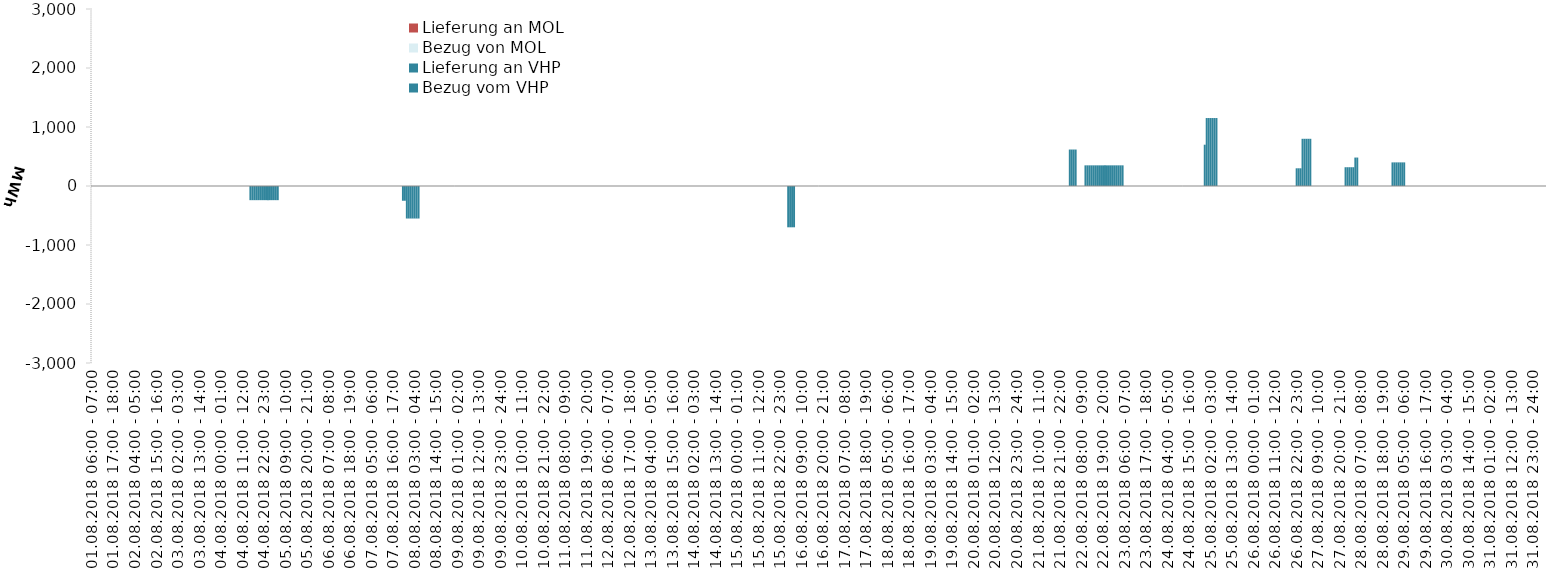
| Category | Bezug vom VHP | Lieferung an VHP | Bezug von MOL | Lieferung an MOL |
|---|---|---|---|---|
| 01.08.2018 06:00 - 07:00 | 0 | 0 | 0 | 0 |
| 01.08.2018 07:00 - 08:00 | 0 | 0 | 0 | 0 |
| 01.08.2018 08:00 - 09:00 | 0 | 0 | 0 | 0 |
| 01.08.2018 09:00 - 10:00 | 0 | 0 | 0 | 0 |
| 01.08.2018 10:00 - 11:00 | 0 | 0 | 0 | 0 |
| 01.08.2018 11:00 - 12:00 | 0 | 0 | 0 | 0 |
| 01.08.2018 12:00 - 13:00 | 0 | 0 | 0 | 0 |
| 01.08.2018 13:00 - 14:00 | 0 | 0 | 0 | 0 |
| 01.08.2018 14:00 - 15:00 | 0 | 0 | 0 | 0 |
| 01.08.2018 15:00 - 16:00 | 0 | 0 | 0 | 0 |
| 01.08.2018 16:00 - 17:00 | 0 | 0 | 0 | 0 |
| 01.08.2018 17:00 - 18:00 | 0 | 0 | 0 | 0 |
| 01.08.2018 18:00 - 19:00 | 0 | 0 | 0 | 0 |
| 01.08.2018 19:00 - 20:00 | 0 | 0 | 0 | 0 |
| 01.08.2018 20:00 - 21:00 | 0 | 0 | 0 | 0 |
| 01.08.2018 21:00 - 22:00 | 0 | 0 | 0 | 0 |
| 01.08.2018 22:00 - 23:00 | 0 | 0 | 0 | 0 |
| 01.08.2018 23:00 - 24:00 | 0 | 0 | 0 | 0 |
| 02.08.2018 00:00 - 01:00 | 0 | 0 | 0 | 0 |
| 02.08.2018 01:00 - 02:00 | 0 | 0 | 0 | 0 |
| 02.08.2018 02:00 - 03:00 | 0 | 0 | 0 | 0 |
| 02.08.2018 03:00 - 04:00 | 0 | 0 | 0 | 0 |
| 02.08.2018 04:00 - 05:00 | 0 | 0 | 0 | 0 |
| 02.08.2018 05:00 - 06:00 | 0 | 0 | 0 | 0 |
| 02.08.2018 06:00 - 07:00 | 0 | 0 | 0 | 0 |
| 02.08.2018 07:00 - 08:00 | 0 | 0 | 0 | 0 |
| 02.08.2018 08:00 - 09:00 | 0 | 0 | 0 | 0 |
| 02.08.2018 09:00 - 10:00 | 0 | 0 | 0 | 0 |
| 02.08.2018 10:00 - 11:00 | 0 | 0 | 0 | 0 |
| 02.08.2018 11:00 - 12:00 | 0 | 0 | 0 | 0 |
| 02.08.2018 12:00 - 13:00 | 0 | 0 | 0 | 0 |
| 02.08.2018 13:00 - 14:00 | 0 | 0 | 0 | 0 |
| 02.08.2018 14:00 - 15:00 | 0 | 0 | 0 | 0 |
| 02.08.2018 15:00 - 16:00 | 0 | 0 | 0 | 0 |
| 02.08.2018 16:00 - 17:00 | 0 | 0 | 0 | 0 |
| 02.08.2018 17:00 - 18:00 | 0 | 0 | 0 | 0 |
| 02.08.2018 18:00 - 19:00 | 0 | 0 | 0 | 0 |
| 02.08.2018 19:00 - 20:00 | 0 | 0 | 0 | 0 |
| 02.08.2018 20:00 - 21:00 | 0 | 0 | 0 | 0 |
| 02.08.2018 21:00 - 22:00 | 0 | 0 | 0 | 0 |
| 02.08.2018 22:00 - 23:00 | 0 | 0 | 0 | 0 |
| 02.08.2018 23:00 - 24:00 | 0 | 0 | 0 | 0 |
| 03.08.2018 00:00 - 01:00 | 0 | 0 | 0 | 0 |
| 03.08.2018 01:00 - 02:00 | 0 | 0 | 0 | 0 |
| 03.08.2018 02:00 - 03:00 | 0 | 0 | 0 | 0 |
| 03.08.2018 03:00 - 04:00 | 0 | 0 | 0 | 0 |
| 03.08.2018 04:00 - 05:00 | 0 | 0 | 0 | 0 |
| 03.08.2018 05:00 - 06:00 | 0 | 0 | 0 | 0 |
| 03.08.2018 06:00 - 07:00 | 0 | 0 | 0 | 0 |
| 03.08.2018 07:00 - 08:00 | 0 | 0 | 0 | 0 |
| 03.08.2018 08:00 - 09:00 | 0 | 0 | 0 | 0 |
| 03.08.2018 09:00 - 10:00 | 0 | 0 | 0 | 0 |
| 03.08.2018 10:00 - 11:00 | 0 | 0 | 0 | 0 |
| 03.08.2018 11:00 - 12:00 | 0 | 0 | 0 | 0 |
| 03.08.2018 12:00 - 13:00 | 0 | 0 | 0 | 0 |
| 03.08.2018 13:00 - 14:00 | 0 | 0 | 0 | 0 |
| 03.08.2018 14:00 - 15:00 | 0 | 0 | 0 | 0 |
| 03.08.2018 15:00 - 16:00 | 0 | 0 | 0 | 0 |
| 03.08.2018 16:00 - 17:00 | 0 | 0 | 0 | 0 |
| 03.08.2018 17:00 - 18:00 | 0 | 0 | 0 | 0 |
| 03.08.2018 18:00 - 19:00 | 0 | 0 | 0 | 0 |
| 03.08.2018 19:00 - 20:00 | 0 | 0 | 0 | 0 |
| 03.08.2018 20:00 - 21:00 | 0 | 0 | 0 | 0 |
| 03.08.2018 21:00 - 22:00 | 0 | 0 | 0 | 0 |
| 03.08.2018 22:00 - 23:00 | 0 | 0 | 0 | 0 |
| 03.08.2018 23:00 - 24:00 | 0 | 0 | 0 | 0 |
| 04.08.2018 00:00 - 01:00 | 0 | 0 | 0 | 0 |
| 04.08.2018 01:00 - 02:00 | 0 | 0 | 0 | 0 |
| 04.08.2018 02:00 - 03:00 | 0 | 0 | 0 | 0 |
| 04.08.2018 03:00 - 04:00 | 0 | 0 | 0 | 0 |
| 04.08.2018 04:00 - 05:00 | 0 | 0 | 0 | 0 |
| 04.08.2018 05:00 - 06:00 | 0 | 0 | 0 | 0 |
| 04.08.2018 06:00 - 07:00 | 0 | 0 | 0 | 0 |
| 04.08.2018 07:00 - 08:00 | 0 | 0 | 0 | 0 |
| 04.08.2018 08:00 - 09:00 | 0 | 0 | 0 | 0 |
| 04.08.2018 09:00 - 10:00 | 0 | 0 | 0 | 0 |
| 04.08.2018 10:00 - 11:00 | 0 | 0 | 0 | 0 |
| 04.08.2018 11:00 - 12:00 | 0 | 0 | 0 | 0 |
| 04.08.2018 12:00 - 13:00 | 0 | 0 | 0 | 0 |
| 04.08.2018 13:00 - 14:00 | 0 | 0 | 0 | 0 |
| 04.08.2018 14:00 - 15:00 | 0 | 0 | 0 | 0 |
| 04.08.2018 15:00 - 16:00 | 0 | -240 | 0 | 0 |
| 04.08.2018 16:00 - 17:00 | 0 | -240 | 0 | 0 |
| 04.08.2018 17:00 - 18:00 | 0 | -240 | 0 | 0 |
| 04.08.2018 18:00 - 19:00 | 0 | -240 | 0 | 0 |
| 04.08.2018 19:00 - 20:00 | 0 | -240 | 0 | 0 |
| 04.08.2018 20:00 - 21:00 | 0 | -240 | 0 | 0 |
| 04.08.2018 21:00 - 22:00 | 0 | -240 | 0 | 0 |
| 04.08.2018 22:00 - 23:00 | 0 | -240 | 0 | 0 |
| 04.08.2018 23:00 - 24:00 | 0 | -240 | 0 | 0 |
| 05.08.2018 00:00 - 01:00 | 0 | -240 | 0 | 0 |
| 05.08.2018 01:00 - 02:00 | 0 | -240 | 0 | 0 |
| 05.08.2018 02:00 - 03:00 | 0 | -240 | 0 | 0 |
| 05.08.2018 03:00 - 04:00 | 0 | -240 | 0 | 0 |
| 05.08.2018 04:00 - 05:00 | 0 | -240 | 0 | 0 |
| 05.08.2018 05:00 - 06:00 | 0 | -240 | 0 | 0 |
| 05.08.2018 06:00 - 07:00 | 0 | 0 | 0 | 0 |
| 05.08.2018 07:00 - 08:00 | 0 | 0 | 0 | 0 |
| 05.08.2018 08:00 - 09:00 | 0 | 0 | 0 | 0 |
| 05.08.2018 09:00 - 10:00 | 0 | 0 | 0 | 0 |
| 05.08.2018 10:00 - 11:00 | 0 | 0 | 0 | 0 |
| 05.08.2018 11:00 - 12:00 | 0 | 0 | 0 | 0 |
| 05.08.2018 12:00 - 13:00 | 0 | 0 | 0 | 0 |
| 05.08.2018 13:00 - 14:00 | 0 | 0 | 0 | 0 |
| 05.08.2018 14:00 - 15:00 | 0 | 0 | 0 | 0 |
| 05.08.2018 15:00 - 16:00 | 0 | 0 | 0 | 0 |
| 05.08.2018 16:00 - 17:00 | 0 | 0 | 0 | 0 |
| 05.08.2018 17:00 - 18:00 | 0 | 0 | 0 | 0 |
| 05.08.2018 18:00 - 19:00 | 0 | 0 | 0 | 0 |
| 05.08.2018 19:00 - 20:00 | 0 | 0 | 0 | 0 |
| 05.08.2018 20:00 - 21:00 | 0 | 0 | 0 | 0 |
| 05.08.2018 21:00 - 22:00 | 0 | 0 | 0 | 0 |
| 05.08.2018 22:00 - 23:00 | 0 | 0 | 0 | 0 |
| 05.08.2018 23:00 - 24:00 | 0 | 0 | 0 | 0 |
| 06.08.2018 00:00 - 01:00 | 0 | 0 | 0 | 0 |
| 06.08.2018 01:00 - 02:00 | 0 | 0 | 0 | 0 |
| 06.08.2018 02:00 - 03:00 | 0 | 0 | 0 | 0 |
| 06.08.2018 03:00 - 04:00 | 0 | 0 | 0 | 0 |
| 06.08.2018 04:00 - 05:00 | 0 | 0 | 0 | 0 |
| 06.08.2018 05:00 - 06:00 | 0 | 0 | 0 | 0 |
| 06.08.2018 06:00 - 07:00 | 0 | 0 | 0 | 0 |
| 06.08.2018 07:00 - 08:00 | 0 | 0 | 0 | 0 |
| 06.08.2018 08:00 - 09:00 | 0 | 0 | 0 | 0 |
| 06.08.2018 09:00 - 10:00 | 0 | 0 | 0 | 0 |
| 06.08.2018 10:00 - 11:00 | 0 | 0 | 0 | 0 |
| 06.08.2018 11:00 - 12:00 | 0 | 0 | 0 | 0 |
| 06.08.2018 12:00 - 13:00 | 0 | 0 | 0 | 0 |
| 06.08.2018 13:00 - 14:00 | 0 | 0 | 0 | 0 |
| 06.08.2018 14:00 - 15:00 | 0 | 0 | 0 | 0 |
| 06.08.2018 15:00 - 16:00 | 0 | 0 | 0 | 0 |
| 06.08.2018 16:00 - 17:00 | 0 | 0 | 0 | 0 |
| 06.08.2018 17:00 - 18:00 | 0 | 0 | 0 | 0 |
| 06.08.2018 18:00 - 19:00 | 0 | 0 | 0 | 0 |
| 06.08.2018 19:00 - 20:00 | 0 | 0 | 0 | 0 |
| 06.08.2018 20:00 - 21:00 | 0 | 0 | 0 | 0 |
| 06.08.2018 21:00 - 22:00 | 0 | 0 | 0 | 0 |
| 06.08.2018 22:00 - 23:00 | 0 | 0 | 0 | 0 |
| 06.08.2018 23:00 - 24:00 | 0 | 0 | 0 | 0 |
| 07.08.2018 00:00 - 01:00 | 0 | 0 | 0 | 0 |
| 07.08.2018 01:00 - 02:00 | 0 | 0 | 0 | 0 |
| 07.08.2018 02:00 - 03:00 | 0 | 0 | 0 | 0 |
| 07.08.2018 03:00 - 04:00 | 0 | 0 | 0 | 0 |
| 07.08.2018 04:00 - 05:00 | 0 | 0 | 0 | 0 |
| 07.08.2018 05:00 - 06:00 | 0 | 0 | 0 | 0 |
| 07.08.2018 06:00 - 07:00 | 0 | 0 | 0 | 0 |
| 07.08.2018 07:00 - 08:00 | 0 | 0 | 0 | 0 |
| 07.08.2018 08:00 - 09:00 | 0 | 0 | 0 | 0 |
| 07.08.2018 09:00 - 10:00 | 0 | 0 | 0 | 0 |
| 07.08.2018 10:00 - 11:00 | 0 | 0 | 0 | 0 |
| 07.08.2018 11:00 - 12:00 | 0 | 0 | 0 | 0 |
| 07.08.2018 12:00 - 13:00 | 0 | 0 | 0 | 0 |
| 07.08.2018 13:00 - 14:00 | 0 | 0 | 0 | 0 |
| 07.08.2018 14:00 - 15:00 | 0 | 0 | 0 | 0 |
| 07.08.2018 15:00 - 16:00 | 0 | 0 | 0 | 0 |
| 07.08.2018 16:00 - 17:00 | 0 | 0 | 0 | 0 |
| 07.08.2018 17:00 - 18:00 | 0 | 0 | 0 | 0 |
| 07.08.2018 18:00 - 19:00 | 0 | 0 | 0 | 0 |
| 07.08.2018 19:00 - 20:00 | 0 | 0 | 0 | 0 |
| 07.08.2018 20:00 - 21:00 | 0 | 0 | 0 | 0 |
| 07.08.2018 21:00 - 22:00 | 0 | -250 | 0 | 0 |
| 07.08.2018 22:00 - 23:00 | 0 | -250 | 0 | 0 |
| 07.08.2018 23:00 - 24:00 | 0 | -551 | 0 | 0 |
| 08.08.2018 00:00 - 01:00 | 0 | -551 | 0 | 0 |
| 08.08.2018 01:00 - 02:00 | 0 | -551 | 0 | 0 |
| 08.08.2018 02:00 - 03:00 | 0 | -551 | 0 | 0 |
| 08.08.2018 03:00 - 04:00 | 0 | -551 | 0 | 0 |
| 08.08.2018 04:00 - 05:00 | 0 | -551 | 0 | 0 |
| 08.08.2018 05:00 - 06:00 | 0 | -551 | 0 | 0 |
| 08.08.2018 06:00 - 07:00 | 0 | 0 | 0 | 0 |
| 08.08.2018 07:00 - 08:00 | 0 | 0 | 0 | 0 |
| 08.08.2018 08:00 - 09:00 | 0 | 0 | 0 | 0 |
| 08.08.2018 09:00 - 10:00 | 0 | 0 | 0 | 0 |
| 08.08.2018 10:00 - 11:00 | 0 | 0 | 0 | 0 |
| 08.08.2018 11:00 - 12:00 | 0 | 0 | 0 | 0 |
| 08.08.2018 12:00 - 13:00 | 0 | 0 | 0 | 0 |
| 08.08.2018 13:00 - 14:00 | 0 | 0 | 0 | 0 |
| 08.08.2018 14:00 - 15:00 | 0 | 0 | 0 | 0 |
| 08.08.2018 15:00 - 16:00 | 0 | 0 | 0 | 0 |
| 08.08.2018 16:00 - 17:00 | 0 | 0 | 0 | 0 |
| 08.08.2018 17:00 - 18:00 | 0 | 0 | 0 | 0 |
| 08.08.2018 18:00 - 19:00 | 0 | 0 | 0 | 0 |
| 08.08.2018 19:00 - 20:00 | 0 | 0 | 0 | 0 |
| 08.08.2018 20:00 - 21:00 | 0 | 0 | 0 | 0 |
| 08.08.2018 21:00 - 22:00 | 0 | 0 | 0 | 0 |
| 08.08.2018 22:00 - 23:00 | 0 | 0 | 0 | 0 |
| 08.08.2018 23:00 - 24:00 | 0 | 0 | 0 | 0 |
| 09.08.2018 00:00 - 01:00 | 0 | 0 | 0 | 0 |
| 09.08.2018 01:00 - 02:00 | 0 | 0 | 0 | 0 |
| 09.08.2018 02:00 - 03:00 | 0 | 0 | 0 | 0 |
| 09.08.2018 03:00 - 04:00 | 0 | 0 | 0 | 0 |
| 09.08.2018 04:00 - 05:00 | 0 | 0 | 0 | 0 |
| 09.08.2018 05:00 - 06:00 | 0 | 0 | 0 | 0 |
| 09.08.2018 06:00 - 07:00 | 0 | 0 | 0 | 0 |
| 09.08.2018 07:00 - 08:00 | 0 | 0 | 0 | 0 |
| 09.08.2018 08:00 - 09:00 | 0 | 0 | 0 | 0 |
| 09.08.2018 09:00 - 10:00 | 0 | 0 | 0 | 0 |
| 09.08.2018 10:00 - 11:00 | 0 | 0 | 0 | 0 |
| 09.08.2018 11:00 - 12:00 | 0 | 0 | 0 | 0 |
| 09.08.2018 12:00 - 13:00 | 0 | 0 | 0 | 0 |
| 09.08.2018 13:00 - 14:00 | 0 | 0 | 0 | 0 |
| 09.08.2018 14:00 - 15:00 | 0 | 0 | 0 | 0 |
| 09.08.2018 15:00 - 16:00 | 0 | 0 | 0 | 0 |
| 09.08.2018 16:00 - 17:00 | 0 | 0 | 0 | 0 |
| 09.08.2018 17:00 - 18:00 | 0 | 0 | 0 | 0 |
| 09.08.2018 18:00 - 19:00 | 0 | 0 | 0 | 0 |
| 09.08.2018 19:00 - 20:00 | 0 | 0 | 0 | 0 |
| 09.08.2018 20:00 - 21:00 | 0 | 0 | 0 | 0 |
| 09.08.2018 21:00 - 22:00 | 0 | 0 | 0 | 0 |
| 09.08.2018 22:00 - 23:00 | 0 | 0 | 0 | 0 |
| 09.08.2018 23:00 - 24:00 | 0 | 0 | 0 | 0 |
| 10.08.2018 00:00 - 01:00 | 0 | 0 | 0 | 0 |
| 10.08.2018 01:00 - 02:00 | 0 | 0 | 0 | 0 |
| 10.08.2018 02:00 - 03:00 | 0 | 0 | 0 | 0 |
| 10.08.2018 03:00 - 04:00 | 0 | 0 | 0 | 0 |
| 10.08.2018 04:00 - 05:00 | 0 | 0 | 0 | 0 |
| 10.08.2018 05:00 - 06:00 | 0 | 0 | 0 | 0 |
| 10.08.2018 06:00 - 07:00 | 0 | 0 | 0 | 0 |
| 10.08.2018 07:00 - 08:00 | 0 | 0 | 0 | 0 |
| 10.08.2018 08:00 - 09:00 | 0 | 0 | 0 | 0 |
| 10.08.2018 09:00 - 10:00 | 0 | 0 | 0 | 0 |
| 10.08.2018 10:00 - 11:00 | 0 | 0 | 0 | 0 |
| 10.08.2018 11:00 - 12:00 | 0 | 0 | 0 | 0 |
| 10.08.2018 12:00 - 13:00 | 0 | 0 | 0 | 0 |
| 10.08.2018 13:00 - 14:00 | 0 | 0 | 0 | 0 |
| 10.08.2018 14:00 - 15:00 | 0 | 0 | 0 | 0 |
| 10.08.2018 15:00 - 16:00 | 0 | 0 | 0 | 0 |
| 10.08.2018 16:00 - 17:00 | 0 | 0 | 0 | 0 |
| 10.08.2018 17:00 - 18:00 | 0 | 0 | 0 | 0 |
| 10.08.2018 18:00 - 19:00 | 0 | 0 | 0 | 0 |
| 10.08.2018 19:00 - 20:00 | 0 | 0 | 0 | 0 |
| 10.08.2018 20:00 - 21:00 | 0 | 0 | 0 | 0 |
| 10.08.2018 21:00 - 22:00 | 0 | 0 | 0 | 0 |
| 10.08.2018 22:00 - 23:00 | 0 | 0 | 0 | 0 |
| 10.08.2018 23:00 - 24:00 | 0 | 0 | 0 | 0 |
| 11.08.2018 00:00 - 01:00 | 0 | 0 | 0 | 0 |
| 11.08.2018 01:00 - 02:00 | 0 | 0 | 0 | 0 |
| 11.08.2018 02:00 - 03:00 | 0 | 0 | 0 | 0 |
| 11.08.2018 03:00 - 04:00 | 0 | 0 | 0 | 0 |
| 11.08.2018 04:00 - 05:00 | 0 | 0 | 0 | 0 |
| 11.08.2018 05:00 - 06:00 | 0 | 0 | 0 | 0 |
| 11.08.2018 06:00 - 07:00 | 0 | 0 | 0 | 0 |
| 11.08.2018 07:00 - 08:00 | 0 | 0 | 0 | 0 |
| 11.08.2018 08:00 - 09:00 | 0 | 0 | 0 | 0 |
| 11.08.2018 09:00 - 10:00 | 0 | 0 | 0 | 0 |
| 11.08.2018 10:00 - 11:00 | 0 | 0 | 0 | 0 |
| 11.08.2018 11:00 - 12:00 | 0 | 0 | 0 | 0 |
| 11.08.2018 12:00 - 13:00 | 0 | 0 | 0 | 0 |
| 11.08.2018 13:00 - 14:00 | 0 | 0 | 0 | 0 |
| 11.08.2018 14:00 - 15:00 | 0 | 0 | 0 | 0 |
| 11.08.2018 15:00 - 16:00 | 0 | 0 | 0 | 0 |
| 11.08.2018 16:00 - 17:00 | 0 | 0 | 0 | 0 |
| 11.08.2018 17:00 - 18:00 | 0 | 0 | 0 | 0 |
| 11.08.2018 18:00 - 19:00 | 0 | 0 | 0 | 0 |
| 11.08.2018 19:00 - 20:00 | 0 | 0 | 0 | 0 |
| 11.08.2018 20:00 - 21:00 | 0 | 0 | 0 | 0 |
| 11.08.2018 21:00 - 22:00 | 0 | 0 | 0 | 0 |
| 11.08.2018 22:00 - 23:00 | 0 | 0 | 0 | 0 |
| 11.08.2018 23:00 - 24:00 | 0 | 0 | 0 | 0 |
| 12.08.2018 00:00 - 01:00 | 0 | 0 | 0 | 0 |
| 12.08.2018 01:00 - 02:00 | 0 | 0 | 0 | 0 |
| 12.08.2018 02:00 - 03:00 | 0 | 0 | 0 | 0 |
| 12.08.2018 03:00 - 04:00 | 0 | 0 | 0 | 0 |
| 12.08.2018 04:00 - 05:00 | 0 | 0 | 0 | 0 |
| 12.08.2018 05:00 - 06:00 | 0 | 0 | 0 | 0 |
| 12.08.2018 06:00 - 07:00 | 0 | 0 | 0 | 0 |
| 12.08.2018 07:00 - 08:00 | 0 | 0 | 0 | 0 |
| 12.08.2018 08:00 - 09:00 | 0 | 0 | 0 | 0 |
| 12.08.2018 09:00 - 10:00 | 0 | 0 | 0 | 0 |
| 12.08.2018 10:00 - 11:00 | 0 | 0 | 0 | 0 |
| 12.08.2018 11:00 - 12:00 | 0 | 0 | 0 | 0 |
| 12.08.2018 12:00 - 13:00 | 0 | 0 | 0 | 0 |
| 12.08.2018 13:00 - 14:00 | 0 | 0 | 0 | 0 |
| 12.08.2018 14:00 - 15:00 | 0 | 0 | 0 | 0 |
| 12.08.2018 15:00 - 16:00 | 0 | 0 | 0 | 0 |
| 12.08.2018 16:00 - 17:00 | 0 | 0 | 0 | 0 |
| 12.08.2018 17:00 - 18:00 | 0 | 0 | 0 | 0 |
| 12.08.2018 18:00 - 19:00 | 0 | 0 | 0 | 0 |
| 12.08.2018 19:00 - 20:00 | 0 | 0 | 0 | 0 |
| 12.08.2018 20:00 - 21:00 | 0 | 0 | 0 | 0 |
| 12.08.2018 21:00 - 22:00 | 0 | 0 | 0 | 0 |
| 12.08.2018 22:00 - 23:00 | 0 | 0 | 0 | 0 |
| 12.08.2018 23:00 - 24:00 | 0 | 0 | 0 | 0 |
| 13.08.2018 00:00 - 01:00 | 0 | 0 | 0 | 0 |
| 13.08.2018 01:00 - 02:00 | 0 | 0 | 0 | 0 |
| 13.08.2018 02:00 - 03:00 | 0 | 0 | 0 | 0 |
| 13.08.2018 03:00 - 04:00 | 0 | 0 | 0 | 0 |
| 13.08.2018 04:00 - 05:00 | 0 | 0 | 0 | 0 |
| 13.08.2018 05:00 - 06:00 | 0 | 0 | 0 | 0 |
| 13.08.2018 06:00 - 07:00 | 0 | 0 | 0 | 0 |
| 13.08.2018 07:00 - 08:00 | 0 | 0 | 0 | 0 |
| 13.08.2018 08:00 - 09:00 | 0 | 0 | 0 | 0 |
| 13.08.2018 09:00 - 10:00 | 0 | 0 | 0 | 0 |
| 13.08.2018 10:00 - 11:00 | 0 | 0 | 0 | 0 |
| 13.08.2018 11:00 - 12:00 | 0 | 0 | 0 | 0 |
| 13.08.2018 12:00 - 13:00 | 0 | 0 | 0 | 0 |
| 13.08.2018 13:00 - 14:00 | 0 | 0 | 0 | 0 |
| 13.08.2018 14:00 - 15:00 | 0 | 0 | 0 | 0 |
| 13.08.2018 15:00 - 16:00 | 0 | 0 | 0 | 0 |
| 13.08.2018 16:00 - 17:00 | 0 | 0 | 0 | 0 |
| 13.08.2018 17:00 - 18:00 | 0 | 0 | 0 | 0 |
| 13.08.2018 18:00 - 19:00 | 0 | 0 | 0 | 0 |
| 13.08.2018 19:00 - 20:00 | 0 | 0 | 0 | 0 |
| 13.08.2018 20:00 - 21:00 | 0 | 0 | 0 | 0 |
| 13.08.2018 21:00 - 22:00 | 0 | 0 | 0 | 0 |
| 13.08.2018 22:00 - 23:00 | 0 | 0 | 0 | 0 |
| 13.08.2018 23:00 - 24:00 | 0 | 0 | 0 | 0 |
| 14.08.2018 00:00 - 01:00 | 0 | 0 | 0 | 0 |
| 14.08.2018 01:00 - 02:00 | 0 | 0 | 0 | 0 |
| 14.08.2018 02:00 - 03:00 | 0 | 0 | 0 | 0 |
| 14.08.2018 03:00 - 04:00 | 0 | 0 | 0 | 0 |
| 14.08.2018 04:00 - 05:00 | 0 | 0 | 0 | 0 |
| 14.08.2018 05:00 - 06:00 | 0 | 0 | 0 | 0 |
| 14.08.2018 06:00 - 07:00 | 0 | 0 | 0 | 0 |
| 14.08.2018 07:00 - 08:00 | 0 | 0 | 0 | 0 |
| 14.08.2018 08:00 - 09:00 | 0 | 0 | 0 | 0 |
| 14.08.2018 09:00 - 10:00 | 0 | 0 | 0 | 0 |
| 14.08.2018 10:00 - 11:00 | 0 | 0 | 0 | 0 |
| 14.08.2018 11:00 - 12:00 | 0 | 0 | 0 | 0 |
| 14.08.2018 12:00 - 13:00 | 0 | 0 | 0 | 0 |
| 14.08.2018 13:00 - 14:00 | 0 | 0 | 0 | 0 |
| 14.08.2018 14:00 - 15:00 | 0 | 0 | 0 | 0 |
| 14.08.2018 15:00 - 16:00 | 0 | 0 | 0 | 0 |
| 14.08.2018 16:00 - 17:00 | 0 | 0 | 0 | 0 |
| 14.08.2018 17:00 - 18:00 | 0 | 0 | 0 | 0 |
| 14.08.2018 18:00 - 19:00 | 0 | 0 | 0 | 0 |
| 14.08.2018 19:00 - 20:00 | 0 | 0 | 0 | 0 |
| 14.08.2018 20:00 - 21:00 | 0 | 0 | 0 | 0 |
| 14.08.2018 21:00 - 22:00 | 0 | 0 | 0 | 0 |
| 14.08.2018 22:00 - 23:00 | 0 | 0 | 0 | 0 |
| 14.08.2018 23:00 - 24:00 | 0 | 0 | 0 | 0 |
| 15.08.2018 00:00 - 01:00 | 0 | 0 | 0 | 0 |
| 15.08.2018 01:00 - 02:00 | 0 | 0 | 0 | 0 |
| 15.08.2018 02:00 - 03:00 | 0 | 0 | 0 | 0 |
| 15.08.2018 03:00 - 04:00 | 0 | 0 | 0 | 0 |
| 15.08.2018 04:00 - 05:00 | 0 | 0 | 0 | 0 |
| 15.08.2018 05:00 - 06:00 | 0 | 0 | 0 | 0 |
| 15.08.2018 06:00 - 07:00 | 0 | 0 | 0 | 0 |
| 15.08.2018 07:00 - 08:00 | 0 | 0 | 0 | 0 |
| 15.08.2018 08:00 - 09:00 | 0 | 0 | 0 | 0 |
| 15.08.2018 09:00 - 10:00 | 0 | 0 | 0 | 0 |
| 15.08.2018 10:00 - 11:00 | 0 | 0 | 0 | 0 |
| 15.08.2018 11:00 - 12:00 | 0 | 0 | 0 | 0 |
| 15.08.2018 12:00 - 13:00 | 0 | 0 | 0 | 0 |
| 15.08.2018 13:00 - 14:00 | 0 | 0 | 0 | 0 |
| 15.08.2018 14:00 - 15:00 | 0 | 0 | 0 | 0 |
| 15.08.2018 15:00 - 16:00 | 0 | 0 | 0 | 0 |
| 15.08.2018 16:00 - 17:00 | 0 | 0 | 0 | 0 |
| 15.08.2018 17:00 - 18:00 | 0 | 0 | 0 | 0 |
| 15.08.2018 18:00 - 19:00 | 0 | 0 | 0 | 0 |
| 15.08.2018 19:00 - 20:00 | 0 | 0 | 0 | 0 |
| 15.08.2018 20:00 - 21:00 | 0 | 0 | 0 | 0 |
| 15.08.2018 21:00 - 22:00 | 0 | 0 | 0 | 0 |
| 15.08.2018 22:00 - 23:00 | 0 | 0 | 0 | 0 |
| 15.08.2018 23:00 - 24:00 | 0 | 0 | 0 | 0 |
| 16.08.2018 00:00 - 01:00 | 0 | 0 | 0 | 0 |
| 16.08.2018 01:00 - 02:00 | 0 | 0 | 0 | 0 |
| 16.08.2018 02:00 - 03:00 | 0 | -700 | 0 | 0 |
| 16.08.2018 03:00 - 04:00 | 0 | -700 | 0 | 0 |
| 16.08.2018 04:00 - 05:00 | 0 | -700 | 0 | 0 |
| 16.08.2018 05:00 - 06:00 | 0 | -700 | 0 | 0 |
| 16.08.2018 06:00 - 07:00 | 0 | 0 | 0 | 0 |
| 16.08.2018 07:00 - 08:00 | 0 | 0 | 0 | 0 |
| 16.08.2018 08:00 - 09:00 | 0 | 0 | 0 | 0 |
| 16.08.2018 09:00 - 10:00 | 0 | 0 | 0 | 0 |
| 16.08.2018 10:00 - 11:00 | 0 | 0 | 0 | 0 |
| 16.08.2018 11:00 - 12:00 | 0 | 0 | 0 | 0 |
| 16.08.2018 12:00 - 13:00 | 0 | 0 | 0 | 0 |
| 16.08.2018 13:00 - 14:00 | 0 | 0 | 0 | 0 |
| 16.08.2018 14:00 - 15:00 | 0 | 0 | 0 | 0 |
| 16.08.2018 15:00 - 16:00 | 0 | 0 | 0 | 0 |
| 16.08.2018 16:00 - 17:00 | 0 | 0 | 0 | 0 |
| 16.08.2018 17:00 - 18:00 | 0 | 0 | 0 | 0 |
| 16.08.2018 18:00 - 19:00 | 0 | 0 | 0 | 0 |
| 16.08.2018 19:00 - 20:00 | 0 | 0 | 0 | 0 |
| 16.08.2018 20:00 - 21:00 | 0 | 0 | 0 | 0 |
| 16.08.2018 21:00 - 22:00 | 0 | 0 | 0 | 0 |
| 16.08.2018 22:00 - 23:00 | 0 | 0 | 0 | 0 |
| 16.08.2018 23:00 - 24:00 | 0 | 0 | 0 | 0 |
| 17.08.2018 00:00 - 01:00 | 0 | 0 | 0 | 0 |
| 17.08.2018 01:00 - 02:00 | 0 | 0 | 0 | 0 |
| 17.08.2018 02:00 - 03:00 | 0 | 0 | 0 | 0 |
| 17.08.2018 03:00 - 04:00 | 0 | 0 | 0 | 0 |
| 17.08.2018 04:00 - 05:00 | 0 | 0 | 0 | 0 |
| 17.08.2018 05:00 - 06:00 | 0 | 0 | 0 | 0 |
| 17.08.2018 06:00 - 07:00 | 0 | 0 | 0 | 0 |
| 17.08.2018 07:00 - 08:00 | 0 | 0 | 0 | 0 |
| 17.08.2018 08:00 - 09:00 | 0 | 0 | 0 | 0 |
| 17.08.2018 09:00 - 10:00 | 0 | 0 | 0 | 0 |
| 17.08.2018 10:00 - 11:00 | 0 | 0 | 0 | 0 |
| 17.08.2018 11:00 - 12:00 | 0 | 0 | 0 | 0 |
| 17.08.2018 12:00 - 13:00 | 0 | 0 | 0 | 0 |
| 17.08.2018 13:00 - 14:00 | 0 | 0 | 0 | 0 |
| 17.08.2018 14:00 - 15:00 | 0 | 0 | 0 | 0 |
| 17.08.2018 15:00 - 16:00 | 0 | 0 | 0 | 0 |
| 17.08.2018 16:00 - 17:00 | 0 | 0 | 0 | 0 |
| 17.08.2018 17:00 - 18:00 | 0 | 0 | 0 | 0 |
| 17.08.2018 18:00 - 19:00 | 0 | 0 | 0 | 0 |
| 17.08.2018 19:00 - 20:00 | 0 | 0 | 0 | 0 |
| 17.08.2018 20:00 - 21:00 | 0 | 0 | 0 | 0 |
| 17.08.2018 21:00 - 22:00 | 0 | 0 | 0 | 0 |
| 17.08.2018 22:00 - 23:00 | 0 | 0 | 0 | 0 |
| 17.08.2018 23:00 - 24:00 | 0 | 0 | 0 | 0 |
| 18.08.2018 00:00 - 01:00 | 0 | 0 | 0 | 0 |
| 18.08.2018 01:00 - 02:00 | 0 | 0 | 0 | 0 |
| 18.08.2018 02:00 - 03:00 | 0 | 0 | 0 | 0 |
| 18.08.2018 03:00 - 04:00 | 0 | 0 | 0 | 0 |
| 18.08.2018 04:00 - 05:00 | 0 | 0 | 0 | 0 |
| 18.08.2018 05:00 - 06:00 | 0 | 0 | 0 | 0 |
| 18.08.2018 06:00 - 07:00 | 0 | 0 | 0 | 0 |
| 18.08.2018 07:00 - 08:00 | 0 | 0 | 0 | 0 |
| 18.08.2018 08:00 - 09:00 | 0 | 0 | 0 | 0 |
| 18.08.2018 09:00 - 10:00 | 0 | 0 | 0 | 0 |
| 18.08.2018 10:00 - 11:00 | 0 | 0 | 0 | 0 |
| 18.08.2018 11:00 - 12:00 | 0 | 0 | 0 | 0 |
| 18.08.2018 12:00 - 13:00 | 0 | 0 | 0 | 0 |
| 18.08.2018 13:00 - 14:00 | 0 | 0 | 0 | 0 |
| 18.08.2018 14:00 - 15:00 | 0 | 0 | 0 | 0 |
| 18.08.2018 15:00 - 16:00 | 0 | 0 | 0 | 0 |
| 18.08.2018 16:00 - 17:00 | 0 | 0 | 0 | 0 |
| 18.08.2018 17:00 - 18:00 | 0 | 0 | 0 | 0 |
| 18.08.2018 18:00 - 19:00 | 0 | 0 | 0 | 0 |
| 18.08.2018 19:00 - 20:00 | 0 | 0 | 0 | 0 |
| 18.08.2018 20:00 - 21:00 | 0 | 0 | 0 | 0 |
| 18.08.2018 21:00 - 22:00 | 0 | 0 | 0 | 0 |
| 18.08.2018 22:00 - 23:00 | 0 | 0 | 0 | 0 |
| 18.08.2018 23:00 - 24:00 | 0 | 0 | 0 | 0 |
| 19.08.2018 00:00 - 01:00 | 0 | 0 | 0 | 0 |
| 19.08.2018 01:00 - 02:00 | 0 | 0 | 0 | 0 |
| 19.08.2018 02:00 - 03:00 | 0 | 0 | 0 | 0 |
| 19.08.2018 03:00 - 04:00 | 0 | 0 | 0 | 0 |
| 19.08.2018 04:00 - 05:00 | 0 | 0 | 0 | 0 |
| 19.08.2018 05:00 - 06:00 | 0 | 0 | 0 | 0 |
| 19.08.2018 06:00 - 07:00 | 0 | 0 | 0 | 0 |
| 19.08.2018 07:00 - 08:00 | 0 | 0 | 0 | 0 |
| 19.08.2018 08:00 - 09:00 | 0 | 0 | 0 | 0 |
| 19.08.2018 09:00 - 10:00 | 0 | 0 | 0 | 0 |
| 19.08.2018 10:00 - 11:00 | 0 | 0 | 0 | 0 |
| 19.08.2018 11:00 - 12:00 | 0 | 0 | 0 | 0 |
| 19.08.2018 12:00 - 13:00 | 0 | 0 | 0 | 0 |
| 19.08.2018 13:00 - 14:00 | 0 | 0 | 0 | 0 |
| 19.08.2018 14:00 - 15:00 | 0 | 0 | 0 | 0 |
| 19.08.2018 15:00 - 16:00 | 0 | 0 | 0 | 0 |
| 19.08.2018 16:00 - 17:00 | 0 | 0 | 0 | 0 |
| 19.08.2018 17:00 - 18:00 | 0 | 0 | 0 | 0 |
| 19.08.2018 18:00 - 19:00 | 0 | 0 | 0 | 0 |
| 19.08.2018 19:00 - 20:00 | 0 | 0 | 0 | 0 |
| 19.08.2018 20:00 - 21:00 | 0 | 0 | 0 | 0 |
| 19.08.2018 21:00 - 22:00 | 0 | 0 | 0 | 0 |
| 19.08.2018 22:00 - 23:00 | 0 | 0 | 0 | 0 |
| 19.08.2018 23:00 - 24:00 | 0 | 0 | 0 | 0 |
| 20.08.2018 00:00 - 01:00 | 0 | 0 | 0 | 0 |
| 20.08.2018 01:00 - 02:00 | 0 | 0 | 0 | 0 |
| 20.08.2018 02:00 - 03:00 | 0 | 0 | 0 | 0 |
| 20.08.2018 03:00 - 04:00 | 0 | 0 | 0 | 0 |
| 20.08.2018 04:00 - 05:00 | 0 | 0 | 0 | 0 |
| 20.08.2018 05:00 - 06:00 | 0 | 0 | 0 | 0 |
| 20.08.2018 06:00 - 07:00 | 0 | 0 | 0 | 0 |
| 20.08.2018 07:00 - 08:00 | 0 | 0 | 0 | 0 |
| 20.08.2018 08:00 - 09:00 | 0 | 0 | 0 | 0 |
| 20.08.2018 09:00 - 10:00 | 0 | 0 | 0 | 0 |
| 20.08.2018 10:00 - 11:00 | 0 | 0 | 0 | 0 |
| 20.08.2018 11:00 - 12:00 | 0 | 0 | 0 | 0 |
| 20.08.2018 12:00 - 13:00 | 0 | 0 | 0 | 0 |
| 20.08.2018 13:00 - 14:00 | 0 | 0 | 0 | 0 |
| 20.08.2018 14:00 - 15:00 | 0 | 0 | 0 | 0 |
| 20.08.2018 15:00 - 16:00 | 0 | 0 | 0 | 0 |
| 20.08.2018 16:00 - 17:00 | 0 | 0 | 0 | 0 |
| 20.08.2018 17:00 - 18:00 | 0 | 0 | 0 | 0 |
| 20.08.2018 18:00 - 19:00 | 0 | 0 | 0 | 0 |
| 20.08.2018 19:00 - 20:00 | 0 | 0 | 0 | 0 |
| 20.08.2018 20:00 - 21:00 | 0 | 0 | 0 | 0 |
| 20.08.2018 21:00 - 22:00 | 0 | 0 | 0 | 0 |
| 20.08.2018 22:00 - 23:00 | 0 | 0 | 0 | 0 |
| 20.08.2018 23:00 - 24:00 | 0 | 0 | 0 | 0 |
| 21.08.2018 00:00 - 01:00 | 0 | 0 | 0 | 0 |
| 21.08.2018 01:00 - 02:00 | 0 | 0 | 0 | 0 |
| 21.08.2018 02:00 - 03:00 | 0 | 0 | 0 | 0 |
| 21.08.2018 03:00 - 04:00 | 0 | 0 | 0 | 0 |
| 21.08.2018 04:00 - 05:00 | 0 | 0 | 0 | 0 |
| 21.08.2018 05:00 - 06:00 | 0 | 0 | 0 | 0 |
| 21.08.2018 06:00 - 07:00 | 0 | 0 | 0 | 0 |
| 21.08.2018 07:00 - 08:00 | 0 | 0 | 0 | 0 |
| 21.08.2018 08:00 - 09:00 | 0 | 0 | 0 | 0 |
| 21.08.2018 09:00 - 10:00 | 0 | 0 | 0 | 0 |
| 21.08.2018 10:00 - 11:00 | 0 | 0 | 0 | 0 |
| 21.08.2018 11:00 - 12:00 | 0 | 0 | 0 | 0 |
| 21.08.2018 12:00 - 13:00 | 0 | 0 | 0 | 0 |
| 21.08.2018 13:00 - 14:00 | 0 | 0 | 0 | 0 |
| 21.08.2018 14:00 - 15:00 | 0 | 0 | 0 | 0 |
| 21.08.2018 15:00 - 16:00 | 0 | 0 | 0 | 0 |
| 21.08.2018 16:00 - 17:00 | 0 | 0 | 0 | 0 |
| 21.08.2018 17:00 - 18:00 | 0 | 0 | 0 | 0 |
| 21.08.2018 18:00 - 19:00 | 0 | 0 | 0 | 0 |
| 21.08.2018 19:00 - 20:00 | 0 | 0 | 0 | 0 |
| 21.08.2018 20:00 - 21:00 | 0 | 0 | 0 | 0 |
| 21.08.2018 21:00 - 22:00 | 0 | 0 | 0 | 0 |
| 21.08.2018 22:00 - 23:00 | 0 | 0 | 0 | 0 |
| 21.08.2018 23:00 - 24:00 | 0 | 0 | 0 | 0 |
| 22.08.2018 00:00 - 01:00 | 0 | 0 | 0 | 0 |
| 22.08.2018 01:00 - 02:00 | 0 | 0 | 0 | 0 |
| 22.08.2018 02:00 - 03:00 | 618 | 0 | 0 | 0 |
| 22.08.2018 03:00 - 04:00 | 618 | 0 | 0 | 0 |
| 22.08.2018 04:00 - 05:00 | 618 | 0 | 0 | 0 |
| 22.08.2018 05:00 - 06:00 | 618 | 0 | 0 | 0 |
| 22.08.2018 06:00 - 07:00 | 0 | 0 | 0 | 0 |
| 22.08.2018 07:00 - 08:00 | 0 | 0 | 0 | 0 |
| 22.08.2018 08:00 - 09:00 | 0 | 0 | 0 | 0 |
| 22.08.2018 09:00 - 10:00 | 0 | 0 | 0 | 0 |
| 22.08.2018 10:00 - 11:00 | 350 | 0 | 0 | 0 |
| 22.08.2018 11:00 - 12:00 | 350 | 0 | 0 | 0 |
| 22.08.2018 12:00 - 13:00 | 350 | 0 | 0 | 0 |
| 22.08.2018 13:00 - 14:00 | 350 | 0 | 0 | 0 |
| 22.08.2018 14:00 - 15:00 | 350 | 0 | 0 | 0 |
| 22.08.2018 15:00 - 16:00 | 350 | 0 | 0 | 0 |
| 22.08.2018 16:00 - 17:00 | 350 | 0 | 0 | 0 |
| 22.08.2018 17:00 - 18:00 | 350 | 0 | 0 | 0 |
| 22.08.2018 18:00 - 19:00 | 350 | 0 | 0 | 0 |
| 22.08.2018 19:00 - 20:00 | 350 | 0 | 0 | 0 |
| 22.08.2018 20:00 - 21:00 | 350 | 0 | 0 | 0 |
| 22.08.2018 21:00 - 22:00 | 350 | 0 | 0 | 0 |
| 22.08.2018 22:00 - 23:00 | 350 | 0 | 0 | 0 |
| 22.08.2018 23:00 - 24:00 | 350 | 0 | 0 | 0 |
| 23.08.2018 00:00 - 01:00 | 350 | 0 | 0 | 0 |
| 23.08.2018 01:00 - 02:00 | 350 | 0 | 0 | 0 |
| 23.08.2018 02:00 - 03:00 | 350 | 0 | 0 | 0 |
| 23.08.2018 03:00 - 04:00 | 350 | 0 | 0 | 0 |
| 23.08.2018 04:00 - 05:00 | 350 | 0 | 0 | 0 |
| 23.08.2018 05:00 - 06:00 | 350 | 0 | 0 | 0 |
| 23.08.2018 06:00 - 07:00 | 0 | 0 | 0 | 0 |
| 23.08.2018 07:00 - 08:00 | 0 | 0 | 0 | 0 |
| 23.08.2018 08:00 - 09:00 | 0 | 0 | 0 | 0 |
| 23.08.2018 09:00 - 10:00 | 0 | 0 | 0 | 0 |
| 23.08.2018 10:00 - 11:00 | 0 | 0 | 0 | 0 |
| 23.08.2018 11:00 - 12:00 | 0 | 0 | 0 | 0 |
| 23.08.2018 12:00 - 13:00 | 0 | 0 | 0 | 0 |
| 23.08.2018 13:00 - 14:00 | 0 | 0 | 0 | 0 |
| 23.08.2018 14:00 - 15:00 | 0 | 0 | 0 | 0 |
| 23.08.2018 15:00 - 16:00 | 0 | 0 | 0 | 0 |
| 23.08.2018 16:00 - 17:00 | 0 | 0 | 0 | 0 |
| 23.08.2018 17:00 - 18:00 | 0 | 0 | 0 | 0 |
| 23.08.2018 18:00 - 19:00 | 0 | 0 | 0 | 0 |
| 23.08.2018 19:00 - 20:00 | 0 | 0 | 0 | 0 |
| 23.08.2018 20:00 - 21:00 | 0 | 0 | 0 | 0 |
| 23.08.2018 21:00 - 22:00 | 0 | 0 | 0 | 0 |
| 23.08.2018 22:00 - 23:00 | 0 | 0 | 0 | 0 |
| 23.08.2018 23:00 - 24:00 | 0 | 0 | 0 | 0 |
| 24.08.2018 00:00 - 01:00 | 0 | 0 | 0 | 0 |
| 24.08.2018 01:00 - 02:00 | 0 | 0 | 0 | 0 |
| 24.08.2018 02:00 - 03:00 | 0 | 0 | 0 | 0 |
| 24.08.2018 03:00 - 04:00 | 0 | 0 | 0 | 0 |
| 24.08.2018 04:00 - 05:00 | 0 | 0 | 0 | 0 |
| 24.08.2018 05:00 - 06:00 | 0 | 0 | 0 | 0 |
| 24.08.2018 06:00 - 07:00 | 0 | 0 | 0 | 0 |
| 24.08.2018 07:00 - 08:00 | 0 | 0 | 0 | 0 |
| 24.08.2018 08:00 - 09:00 | 0 | 0 | 0 | 0 |
| 24.08.2018 09:00 - 10:00 | 0 | 0 | 0 | 0 |
| 24.08.2018 10:00 - 11:00 | 0 | 0 | 0 | 0 |
| 24.08.2018 11:00 - 12:00 | 0 | 0 | 0 | 0 |
| 24.08.2018 12:00 - 13:00 | 0 | 0 | 0 | 0 |
| 24.08.2018 13:00 - 14:00 | 0 | 0 | 0 | 0 |
| 24.08.2018 14:00 - 15:00 | 0 | 0 | 0 | 0 |
| 24.08.2018 15:00 - 16:00 | 0 | 0 | 0 | 0 |
| 24.08.2018 16:00 - 17:00 | 0 | 0 | 0 | 0 |
| 24.08.2018 17:00 - 18:00 | 0 | 0 | 0 | 0 |
| 24.08.2018 18:00 - 19:00 | 0 | 0 | 0 | 0 |
| 24.08.2018 19:00 - 20:00 | 0 | 0 | 0 | 0 |
| 24.08.2018 20:00 - 21:00 | 0 | 0 | 0 | 0 |
| 24.08.2018 21:00 - 22:00 | 0 | 0 | 0 | 0 |
| 24.08.2018 22:00 - 23:00 | 0 | 0 | 0 | 0 |
| 24.08.2018 23:00 - 24:00 | 700 | 0 | 0 | 0 |
| 25.08.2018 00:00 - 01:00 | 1152 | 0 | 0 | 0 |
| 25.08.2018 01:00 - 02:00 | 1152 | 0 | 0 | 0 |
| 25.08.2018 02:00 - 03:00 | 1152 | 0 | 0 | 0 |
| 25.08.2018 03:00 - 04:00 | 1152 | 0 | 0 | 0 |
| 25.08.2018 04:00 - 05:00 | 1152 | 0 | 0 | 0 |
| 25.08.2018 05:00 - 06:00 | 1152 | 0 | 0 | 0 |
| 25.08.2018 06:00 - 07:00 | 0 | 0 | 0 | 0 |
| 25.08.2018 07:00 - 08:00 | 0 | 0 | 0 | 0 |
| 25.08.2018 08:00 - 09:00 | 0 | 0 | 0 | 0 |
| 25.08.2018 09:00 - 10:00 | 0 | 0 | 0 | 0 |
| 25.08.2018 10:00 - 11:00 | 0 | 0 | 0 | 0 |
| 25.08.2018 11:00 - 12:00 | 0 | 0 | 0 | 0 |
| 25.08.2018 12:00 - 13:00 | 0 | 0 | 0 | 0 |
| 25.08.2018 13:00 - 14:00 | 0 | 0 | 0 | 0 |
| 25.08.2018 14:00 - 15:00 | 0 | 0 | 0 | 0 |
| 25.08.2018 15:00 - 16:00 | 0 | 0 | 0 | 0 |
| 25.08.2018 16:00 - 17:00 | 0 | 0 | 0 | 0 |
| 25.08.2018 17:00 - 18:00 | 0 | 0 | 0 | 0 |
| 25.08.2018 18:00 - 19:00 | 0 | 0 | 0 | 0 |
| 25.08.2018 19:00 - 20:00 | 0 | 0 | 0 | 0 |
| 25.08.2018 20:00 - 21:00 | 0 | 0 | 0 | 0 |
| 25.08.2018 21:00 - 22:00 | 0 | 0 | 0 | 0 |
| 25.08.2018 22:00 - 23:00 | 0 | 0 | 0 | 0 |
| 25.08.2018 23:00 - 24:00 | 0 | 0 | 0 | 0 |
| 26.08.2018 00:00 - 01:00 | 0 | 0 | 0 | 0 |
| 26.08.2018 01:00 - 02:00 | 0 | 0 | 0 | 0 |
| 26.08.2018 02:00 - 03:00 | 0 | 0 | 0 | 0 |
| 26.08.2018 03:00 - 04:00 | 0 | 0 | 0 | 0 |
| 26.08.2018 04:00 - 05:00 | 0 | 0 | 0 | 0 |
| 26.08.2018 05:00 - 06:00 | 0 | 0 | 0 | 0 |
| 26.08.2018 06:00 - 07:00 | 0 | 0 | 0 | 0 |
| 26.08.2018 07:00 - 08:00 | 0 | 0 | 0 | 0 |
| 26.08.2018 08:00 - 09:00 | 0 | 0 | 0 | 0 |
| 26.08.2018 09:00 - 10:00 | 0 | 0 | 0 | 0 |
| 26.08.2018 10:00 - 11:00 | 0 | 0 | 0 | 0 |
| 26.08.2018 11:00 - 12:00 | 0 | 0 | 0 | 0 |
| 26.08.2018 12:00 - 13:00 | 0 | 0 | 0 | 0 |
| 26.08.2018 13:00 - 14:00 | 0 | 0 | 0 | 0 |
| 26.08.2018 14:00 - 15:00 | 0 | 0 | 0 | 0 |
| 26.08.2018 15:00 - 16:00 | 0 | 0 | 0 | 0 |
| 26.08.2018 16:00 - 17:00 | 0 | 0 | 0 | 0 |
| 26.08.2018 17:00 - 18:00 | 0 | 0 | 0 | 0 |
| 26.08.2018 18:00 - 19:00 | 0 | 0 | 0 | 0 |
| 26.08.2018 19:00 - 20:00 | 0 | 0 | 0 | 0 |
| 26.08.2018 20:00 - 21:00 | 0 | 0 | 0 | 0 |
| 26.08.2018 21:00 - 22:00 | 0 | 0 | 0 | 0 |
| 26.08.2018 22:00 - 23:00 | 300 | 0 | 0 | 0 |
| 26.08.2018 23:00 - 24:00 | 300 | 0 | 0 | 0 |
| 27.08.2018 00:00 - 01:00 | 300 | 0 | 0 | 0 |
| 27.08.2018 01:00 - 02:00 | 800 | 0 | 0 | 0 |
| 27.08.2018 02:00 - 03:00 | 800 | 0 | 0 | 0 |
| 27.08.2018 03:00 - 04:00 | 800 | 0 | 0 | 0 |
| 27.08.2018 04:00 - 05:00 | 800 | 0 | 0 | 0 |
| 27.08.2018 05:00 - 06:00 | 800 | 0 | 0 | 0 |
| 27.08.2018 06:00 - 07:00 | 0 | 0 | 0 | 0 |
| 27.08.2018 07:00 - 08:00 | 0 | 0 | 0 | 0 |
| 27.08.2018 08:00 - 09:00 | 0 | 0 | 0 | 0 |
| 27.08.2018 09:00 - 10:00 | 0 | 0 | 0 | 0 |
| 27.08.2018 10:00 - 11:00 | 0 | 0 | 0 | 0 |
| 27.08.2018 11:00 - 12:00 | 0 | 0 | 0 | 0 |
| 27.08.2018 12:00 - 13:00 | 0 | 0 | 0 | 0 |
| 27.08.2018 13:00 - 14:00 | 0 | 0 | 0 | 0 |
| 27.08.2018 14:00 - 15:00 | 0 | 0 | 0 | 0 |
| 27.08.2018 15:00 - 16:00 | 0 | 0 | 0 | 0 |
| 27.08.2018 16:00 - 17:00 | 0 | 0 | 0 | 0 |
| 27.08.2018 17:00 - 18:00 | 0 | 0 | 0 | 0 |
| 27.08.2018 18:00 - 19:00 | 0 | 0 | 0 | 0 |
| 27.08.2018 19:00 - 20:00 | 0 | 0 | 0 | 0 |
| 27.08.2018 20:00 - 21:00 | 0 | 0 | 0 | 0 |
| 27.08.2018 21:00 - 22:00 | 0 | 0 | 0 | 0 |
| 27.08.2018 22:00 - 23:00 | 0 | 0 | 0 | 0 |
| 27.08.2018 23:00 - 24:00 | 318 | 0 | 0 | 0 |
| 28.08.2018 00:00 - 01:00 | 318 | 0 | 0 | 0 |
| 28.08.2018 01:00 - 02:00 | 318 | 0 | 0 | 0 |
| 28.08.2018 02:00 - 03:00 | 318 | 0 | 0 | 0 |
| 28.08.2018 03:00 - 04:00 | 318 | 0 | 0 | 0 |
| 28.08.2018 04:00 - 05:00 | 482 | 0 | 0 | 0 |
| 28.08.2018 05:00 - 06:00 | 482 | 0 | 0 | 0 |
| 28.08.2018 06:00 - 07:00 | 0 | 0 | 0 | 0 |
| 28.08.2018 07:00 - 08:00 | 0 | 0 | 0 | 0 |
| 28.08.2018 08:00 - 09:00 | 0 | 0 | 0 | 0 |
| 28.08.2018 09:00 - 10:00 | 0 | 0 | 0 | 0 |
| 28.08.2018 10:00 - 11:00 | 0 | 0 | 0 | 0 |
| 28.08.2018 11:00 - 12:00 | 0 | 0 | 0 | 0 |
| 28.08.2018 12:00 - 13:00 | 0 | 0 | 0 | 0 |
| 28.08.2018 13:00 - 14:00 | 0 | 0 | 0 | 0 |
| 28.08.2018 14:00 - 15:00 | 0 | 0 | 0 | 0 |
| 28.08.2018 15:00 - 16:00 | 0 | 0 | 0 | 0 |
| 28.08.2018 16:00 - 17:00 | 0 | 0 | 0 | 0 |
| 28.08.2018 17:00 - 18:00 | 0 | 0 | 0 | 0 |
| 28.08.2018 18:00 - 19:00 | 0 | 0 | 0 | 0 |
| 28.08.2018 19:00 - 20:00 | 0 | 0 | 0 | 0 |
| 28.08.2018 20:00 - 21:00 | 0 | 0 | 0 | 0 |
| 28.08.2018 21:00 - 22:00 | 0 | 0 | 0 | 0 |
| 28.08.2018 22:00 - 23:00 | 0 | 0 | 0 | 0 |
| 28.08.2018 23:00 - 24:00 | 400 | 0 | 0 | 0 |
| 29.08.2018 00:00 - 01:00 | 400 | 0 | 0 | 0 |
| 29.08.2018 01:00 - 02:00 | 400 | 0 | 0 | 0 |
| 29.08.2018 02:00 - 03:00 | 400 | 0 | 0 | 0 |
| 29.08.2018 03:00 - 04:00 | 400 | 0 | 0 | 0 |
| 29.08.2018 04:00 - 05:00 | 400 | 0 | 0 | 0 |
| 29.08.2018 05:00 - 06:00 | 400 | 0 | 0 | 0 |
| 29.08.2018 06:00 - 07:00 | 0 | 0 | 0 | 0 |
| 29.08.2018 07:00 - 08:00 | 0 | 0 | 0 | 0 |
| 29.08.2018 08:00 - 09:00 | 0 | 0 | 0 | 0 |
| 29.08.2018 09:00 - 10:00 | 0 | 0 | 0 | 0 |
| 29.08.2018 10:00 - 11:00 | 0 | 0 | 0 | 0 |
| 29.08.2018 11:00 - 12:00 | 0 | 0 | 0 | 0 |
| 29.08.2018 12:00 - 13:00 | 0 | 0 | 0 | 0 |
| 29.08.2018 13:00 - 14:00 | 0 | 0 | 0 | 0 |
| 29.08.2018 14:00 - 15:00 | 0 | 0 | 0 | 0 |
| 29.08.2018 15:00 - 16:00 | 0 | 0 | 0 | 0 |
| 29.08.2018 16:00 - 17:00 | 0 | 0 | 0 | 0 |
| 29.08.2018 17:00 - 18:00 | 0 | 0 | 0 | 0 |
| 29.08.2018 18:00 - 19:00 | 0 | 0 | 0 | 0 |
| 29.08.2018 19:00 - 20:00 | 0 | 0 | 0 | 0 |
| 29.08.2018 20:00 - 21:00 | 0 | 0 | 0 | 0 |
| 29.08.2018 21:00 - 22:00 | 0 | 0 | 0 | 0 |
| 29.08.2018 22:00 - 23:00 | 0 | 0 | 0 | 0 |
| 29.08.2018 23:00 - 24:00 | 0 | 0 | 0 | 0 |
| 30.08.2018 00:00 - 01:00 | 0 | 0 | 0 | 0 |
| 30.08.2018 01:00 - 02:00 | 0 | 0 | 0 | 0 |
| 30.08.2018 02:00 - 03:00 | 0 | 0 | 0 | 0 |
| 30.08.2018 03:00 - 04:00 | 0 | 0 | 0 | 0 |
| 30.08.2018 04:00 - 05:00 | 0 | 0 | 0 | 0 |
| 30.08.2018 05:00 - 06:00 | 0 | 0 | 0 | 0 |
| 30.08.2018 06:00 - 07:00 | 0 | 0 | 0 | 0 |
| 30.08.2018 07:00 - 08:00 | 0 | 0 | 0 | 0 |
| 30.08.2018 08:00 - 09:00 | 0 | 0 | 0 | 0 |
| 30.08.2018 09:00 - 10:00 | 0 | 0 | 0 | 0 |
| 30.08.2018 10:00 - 11:00 | 0 | 0 | 0 | 0 |
| 30.08.2018 11:00 - 12:00 | 0 | 0 | 0 | 0 |
| 30.08.2018 12:00 - 13:00 | 0 | 0 | 0 | 0 |
| 30.08.2018 13:00 - 14:00 | 0 | 0 | 0 | 0 |
| 30.08.2018 14:00 - 15:00 | 0 | 0 | 0 | 0 |
| 30.08.2018 15:00 - 16:00 | 0 | 0 | 0 | 0 |
| 30.08.2018 16:00 - 17:00 | 0 | 0 | 0 | 0 |
| 30.08.2018 17:00 - 18:00 | 0 | 0 | 0 | 0 |
| 30.08.2018 18:00 - 19:00 | 0 | 0 | 0 | 0 |
| 30.08.2018 19:00 - 20:00 | 0 | 0 | 0 | 0 |
| 30.08.2018 20:00 - 21:00 | 0 | 0 | 0 | 0 |
| 30.08.2018 21:00 - 22:00 | 0 | 0 | 0 | 0 |
| 30.08.2018 22:00 - 23:00 | 0 | 0 | 0 | 0 |
| 30.08.2018 23:00 - 24:00 | 0 | 0 | 0 | 0 |
| 31.08.2018 00:00 - 01:00 | 0 | 0 | 0 | 0 |
| 31.08.2018 01:00 - 02:00 | 0 | 0 | 0 | 0 |
| 31.08.2018 02:00 - 03:00 | 0 | 0 | 0 | 0 |
| 31.08.2018 03:00 - 04:00 | 0 | 0 | 0 | 0 |
| 31.08.2018 04:00 - 05:00 | 0 | 0 | 0 | 0 |
| 31.08.2018 05:00 - 06:00 | 0 | 0 | 0 | 0 |
| 31.08.2018 06:00 - 07:00 | 0 | 0 | 0 | 0 |
| 31.08.2018 07:00 - 08:00 | 0 | 0 | 0 | 0 |
| 31.08.2018 08:00 - 09:00 | 0 | 0 | 0 | 0 |
| 31.08.2018 09:00 - 10:00 | 0 | 0 | 0 | 0 |
| 31.08.2018 10:00 - 11:00 | 0 | 0 | 0 | 0 |
| 31.08.2018 11:00 - 12:00 | 0 | 0 | 0 | 0 |
| 31.08.2018 12:00 - 13:00 | 0 | 0 | 0 | 0 |
| 31.08.2018 13:00 - 14:00 | 0 | 0 | 0 | 0 |
| 31.08.2018 14:00 - 15:00 | 0 | 0 | 0 | 0 |
| 31.08.2018 15:00 - 16:00 | 0 | 0 | 0 | 0 |
| 31.08.2018 16:00 - 17:00 | 0 | 0 | 0 | 0 |
| 31.08.2018 17:00 - 18:00 | 0 | 0 | 0 | 0 |
| 31.08.2018 18:00 - 19:00 | 0 | 0 | 0 | 0 |
| 31.08.2018 19:00 - 20:00 | 0 | 0 | 0 | 0 |
| 31.08.2018 20:00 - 21:00 | 0 | 0 | 0 | 0 |
| 31.08.2018 21:00 - 22:00 | 0 | 0 | 0 | 0 |
| 31.08.2018 22:00 - 23:00 | 0 | 0 | 0 | 0 |
| 31.08.2018 23:00 - 24:00 | 0 | 0 | 0 | 0 |
| 01.09.2018 00:00 - 01:00 | 0 | 0 | 0 | 0 |
| 01.09.2018 01:00 - 02:00 | 0 | 0 | 0 | 0 |
| 01.09.2018 02:00 - 03:00 | 0 | 0 | 0 | 0 |
| 01.09.2018 03:00 - 04:00 | 0 | 0 | 0 | 0 |
| 01.09.2018 04:00 - 05:00 | 0 | 0 | 0 | 0 |
| 01.09.2018 05:00 - 06:00 | 0 | 0 | 0 | 0 |